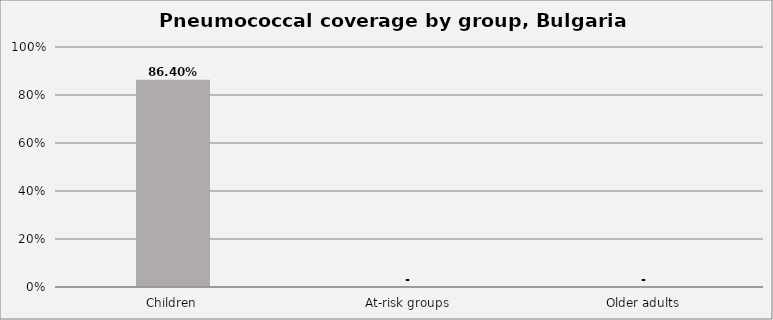
| Category | Series 0 |
|---|---|
| Children | 0.864 |
| At-risk groups | 0 |
| Older adults | 0 |